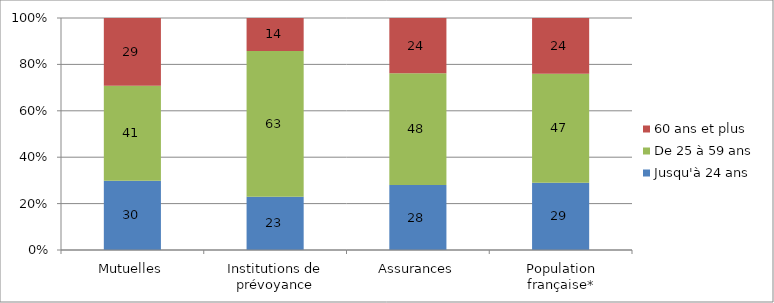
| Category | Jusqu'à 24 ans | De 25 à 59 ans | 60 ans et plus |
|---|---|---|---|
| Mutuelles | 29.806 | 41.035 | 29.158 |
| Institutions de prévoyance | 22.99 | 62.797 | 14.213 |
| Assurances | 27.975 | 48.193 | 23.832 |
| Population française* | 29 | 47 | 24 |